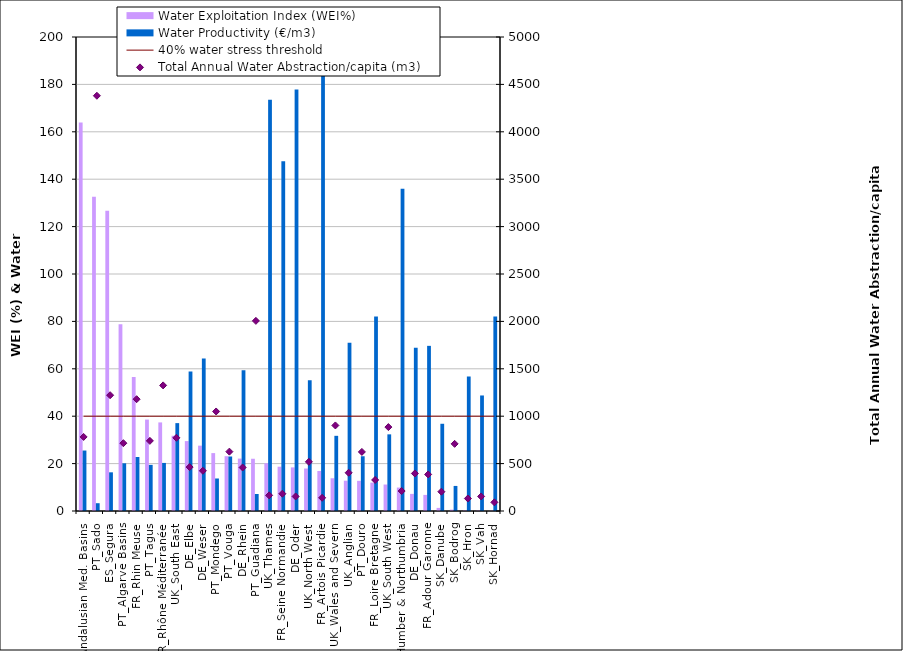
| Category | Water Exploitation Index (WEI%) | Water Productivity (€/m3) |
|---|---|---|
| ES_Andalusian Med. Basins | 163.892 | 25.514 |
| PT_Sado | 132.629 | 3.287 |
| ES_Segura | 126.667 | 16.321 |
| PT_Algarve Basins | 78.84 | 20.13 |
| FR_Rhin Meuse | 56.511 | 22.788 |
| PT_Tagus | 38.576 | 19.466 |
| FR_Rhône Méditerranée | 37.381 | 20.283 |
| UK_South East | 31.735 | 37.081 |
| DE_Elbe | 29.496 | 58.906 |
| DE_Weser | 27.571 | 64.301 |
| PT_Mondego | 24.431 | 13.716 |
| PT_Vouga | 23.116 | 22.995 |
| DE_Rhein | 22.11 | 59.424 |
| PT_Guadiana | 22.043 | 7.18 |
| UK_Thames | 20.148 | 173.514 |
| FR_Seine Normandie | 18.691 | 147.522 |
| DE_Oder | 18.4 | 177.88 |
| UK_North West | 17.926 | 55.201 |
| FR_Artois Picardie | 16.893 | 193.035 |
| UK_Wales and Severn | 13.814 | 31.72 |
| UK_Anglian | 12.793 | 70.963 |
| PT_Douro | 12.73 | 23.103 |
| FR_Loire Bretagne | 11.983 | 82.065 |
| UK_South West | 11.168 | 32.341 |
| UK_Humber & Northumbria | 9.89 | 135.985 |
| DE_Donau | 7.22 | 68.891 |
| FR_Adour Garonne | 6.794 | 69.682 |
| SK_Danube | 1.314 | 36.806 |
| SK_Bodrog | 0.569 | 10.578 |
| SK_Hron | 0.247 | 56.775 |
| SK_Vah | 0.21 | 48.746 |
| SK_Hornad | 0.143 | 82.079 |